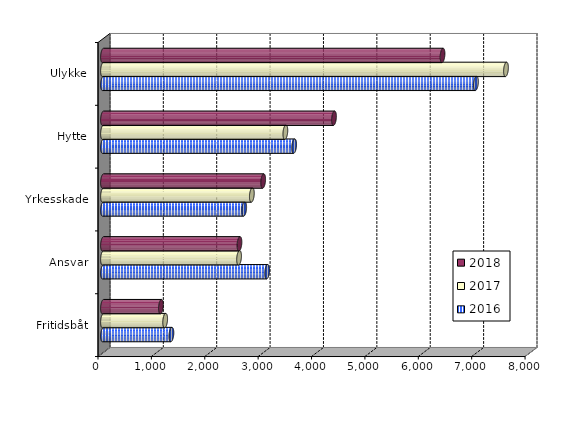
| Category | 2016 | 2017 | 2018 |
|---|---|---|---|
| Fritidsbåt | 1281.456 | 1164.462 | 1085.206 |
| Ansvar | 3075.12 | 2548.829 | 2556.018 |
| Yrkesskade | 2645 | 2788.182 | 3000.34 |
| Hytte | 3580.662 | 3415.952 | 4327.024 |
| Ulykke | 6986 | 7548.886 | 6360.053 |